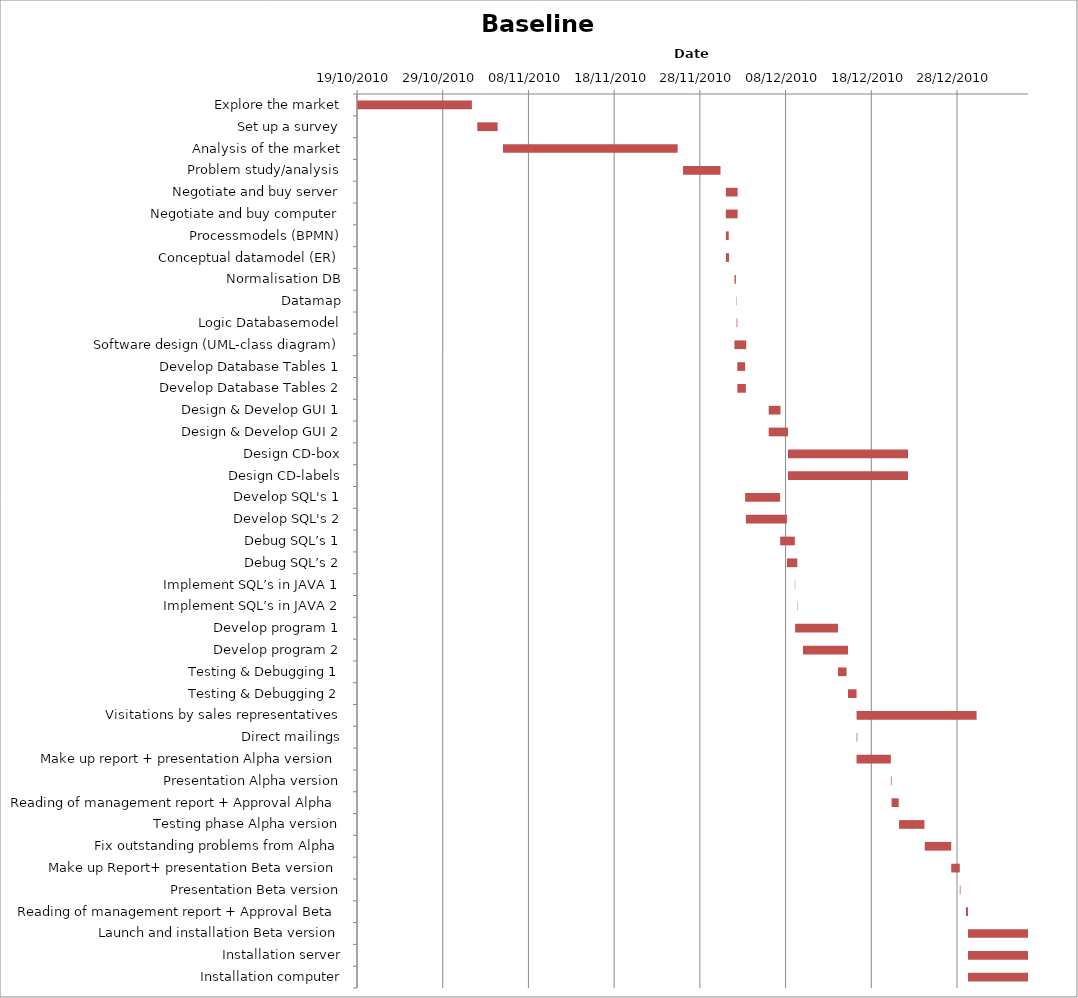
| Category | Baseline start | Actual duration |
|---|---|---|
| Explore the market | 40470.333 | 13.375 |
| Set up a survey | 40484.333 | 2.375 |
| Analysis of the market | 40487.333 | 20.375 |
| Problem study/analysis | 40508.333 | 4.375 |
| Negotiate and buy server | 40513.333 | 1.375 |
| Negotiate and buy computer | 40513.333 | 1.375 |
| Processmodels (BPMN) | 40513.333 | 0.333 |
| Conceptual datamodel (ER) | 40513.333 | 0.375 |
| Normalisation DB | 40514.333 | 0.167 |
| Datamap | 40514.542 | 0.042 |
| Logic Databasemodel | 40514.583 | 0.083 |
| Software design (UML-class diagram) | 40514.333 | 1.375 |
| Develop Database Tables 1 | 40514.667 | 0.917 |
| Develop Database Tables 2 | 40514.667 | 1 |
| Design & Develop GUI 1 | 40518.333 | 1.375 |
| Design & Develop GUI 2 | 40518.333 | 2.25 |
| Design CD-box | 40520.583 | 14 |
| Design CD-labels | 40520.583 | 14 |
| Develop SQL's 1 | 40515.583 | 4.083 |
| Develop SQL's 2 | 40515.667 | 4.792 |
| Debug SQL’s 1 | 40519.667 | 1.708 |
| Debug SQL’s 2 | 40520.458 | 1.208 |
| Implement SQL’s in JAVA 1 | 40521.375 | 0.042 |
| Implement SQL’s in JAVA 2 | 40521.667 | 0.042 |
| Develop program 1 | 40521.417 | 5 |
| Develop program 2 | 40522.333 | 5.25 |
| Testing & Debugging 1 | 40526.417 | 1 |
| Testing & Debugging 2 | 40527.583 | 1 |
| Visitations by sales representatives | 40528.583 | 14 |
| Direct mailings | 40528.583 | 0.083 |
| Make up report + presentation Alpha version | 40528.583 | 4 |
| Presentation Alpha version | 40532.583 | 0.083 |
| Reading of management report + Approval Alpha | 40532.667 | 0.833 |
| Testing phase Alpha version | 40533.542 | 2.958 |
| Fix outstanding problems from Alpha | 40536.542 | 3.083 |
| Make up Report+ presentation Beta version | 40539.625 | 1 |
| Presentation Beta version | 40540.625 | 0.083 |
| Reading of management report + Approval Beta | 40541.333 | 0.25 |
| Launch and installation Beta version | 40541.583 | 7 |
| Installation server | 40541.583 | 7 |
| Installation computer | 40541.583 | 7 |